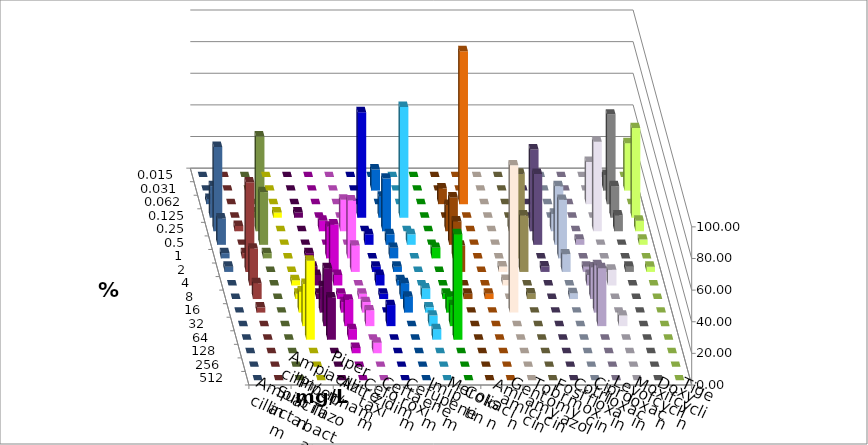
| Category | Ampicillin | Ampicillin/ Sulbactam | Piperacillin | Piperacillin/ Tazobactam | Aztreonam | Cefotaxim | Ceftazidim | Cefuroxim | Imipenem | Meropenem | Colistin | Amikacin | Gentamicin | Tobramycin | Fosfomycin | Cotrimoxazol | Ciprofloxacin | Levofloxacin | Moxifloxacin | Doxycyclin | Tigecyclin |
|---|---|---|---|---|---|---|---|---|---|---|---|---|---|---|---|---|---|---|---|---|---|
| 0.015 | 0 | 0 | 0 | 0 | 0 | 0 | 0 | 0 | 0 | 0 | 0 | 0 | 0 | 0 | 0 | 0 | 0 | 0 | 0 | 0 | 0 |
| 0.031 | 0 | 0 | 0 | 0 | 0 | 13.333 | 0 | 0 | 0 | 0 | 0 | 0 | 0 | 0 | 0 | 0 | 10 | 30 | 0 | 0 | 0 |
| 0.062 | 0 | 0 | 0 | 0 | 0 | 0 | 0 | 0 | 10 | 96.667 | 0 | 0 | 0 | 0 | 0 | 26.667 | 56.667 | 0 | 3.333 | 0 | 0 |
| 0.125 | 3.333 | 3.333 | 0 | 0 | 66.667 | 13.333 | 70 | 0 | 0 | 0 | 0 | 0 | 0 | 0 | 0 | 0 | 20 | 56.667 | 20 | 0 | 3.333 |
| 0.25 | 0 | 0 | 6.667 | 20 | 0 | 33.333 | 0 | 0 | 16.667 | 0 | 0 | 7.143 | 51.724 | 11.111 | 0 | 56.667 | 10 | 6.667 | 53.333 | 3.333 | 60 |
| 0.5 | 0 | 0 | 0 | 0 | 6.667 | 6.667 | 6.667 | 0 | 30 | 0 | 0 | 0 | 44.828 | 37.037 | 3.333 | 0 | 0 | 3.333 | 16.667 | 0 | 33.333 |
| 1.0 | 0 | 3.333 | 20 | 36.667 | 0 | 6.667 | 0 | 6.667 | 23.333 | 0 | 0 | 53.571 | 0 | 37.037 | 0 | 0 | 0 | 0 | 3.333 | 3.333 | 3.333 |
| 2.0 | 0 | 3.333 | 30 | 16.667 | 3.333 | 3.333 | 0 | 0 | 16.667 | 0 | 3.448 | 35.714 | 3.448 | 11.111 | 3.333 | 0 | 3.333 | 3.333 | 3.333 | 56.667 | 0 |
| 4.0 | 3.333 | 6.667 | 6.667 | 0 | 6.667 | 3.333 | 0 | 0 | 0 | 0 | 3.448 | 0 | 0 | 0 | 6.667 | 10 | 0 | 0 | 0 | 23.333 | 0 |
| 8.0 | 3.333 | 3.333 | 3.333 | 3.333 | 3.333 | 10 | 6.667 | 3.333 | 3.333 | 3.333 | 0 | 3.571 | 0 | 3.704 | 20 | 0 | 0 | 0 | 0 | 10 | 0 |
| 16.0 | 13.333 | 16.667 | 6.667 | 6.667 | 0 | 10 | 3.333 | 10 | 0 | 0 | 93.103 | 0 | 0 | 0 | 30 | 0 | 0 | 0 | 0 | 3.333 | 0 |
| 32.0 | 26.667 | 36.667 | 16.667 | 10 | 13.333 | 0 | 6.667 | 13.333 | 0 | 0 | 0 | 0 | 0 | 0 | 36.667 | 6.667 | 0 | 0 | 0 | 0 | 0 |
| 64.0 | 50 | 26.667 | 6.667 | 0 | 0 | 0 | 6.667 | 66.667 | 0 | 0 | 0 | 0 | 0 | 0 | 0 | 0 | 0 | 0 | 0 | 0 | 0 |
| 128.0 | 0 | 0 | 3.333 | 6.667 | 0 | 0 | 0 | 0 | 0 | 0 | 0 | 0 | 0 | 0 | 0 | 0 | 0 | 0 | 0 | 0 | 0 |
| 256.0 | 0 | 0 | 0 | 0 | 0 | 0 | 0 | 0 | 0 | 0 | 0 | 0 | 0 | 0 | 0 | 0 | 0 | 0 | 0 | 0 | 0 |
| 512.0 | 0 | 0 | 0 | 0 | 0 | 0 | 0 | 0 | 0 | 0 | 0 | 0 | 0 | 0 | 0 | 0 | 0 | 0 | 0 | 0 | 0 |